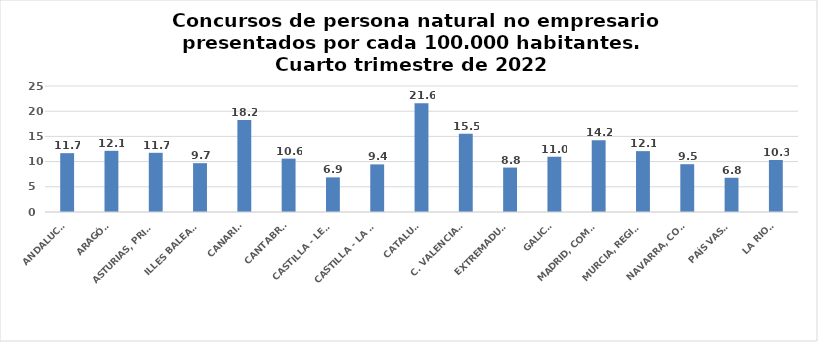
| Category | Series 0 |
|---|---|
| ANDALUCÍA | 11.674 |
| ARAGÓN | 12.139 |
| ASTURIAS, PRINCIPADO | 11.745 |
| ILLES BALEARS | 9.688 |
| CANARIAS | 18.23 |
| CANTABRIA | 10.591 |
| CASTILLA - LEÓN | 6.87 |
| CASTILLA - LA MANCHA | 9.448 |
| CATALUÑA | 21.559 |
| C. VALENCIANA | 15.516 |
| EXTREMADURA | 8.817 |
| GALICIA | 10.965 |
| MADRID, COMUNIDAD | 14.236 |
| MURCIA, REGIÓN | 12.077 |
| NAVARRA, COM. FORAL | 9.486 |
| PAÍS VASCO | 6.793 |
| LA RIOJA | 10.316 |